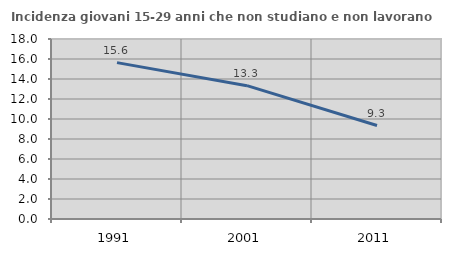
| Category | Incidenza giovani 15-29 anni che non studiano e non lavorano  |
|---|---|
| 1991.0 | 15.636 |
| 2001.0 | 13.333 |
| 2011.0 | 9.346 |